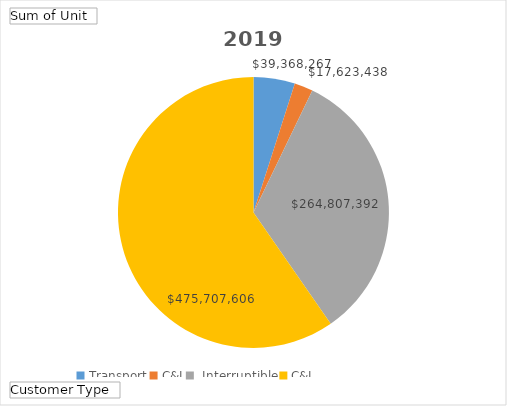
| Category | Total |
|---|---|
| Transport | 39368267 |
| C&I, Interruptible | 17623438 |
| C&I, Firm | 264807392 |
| Residential | 475707606 |